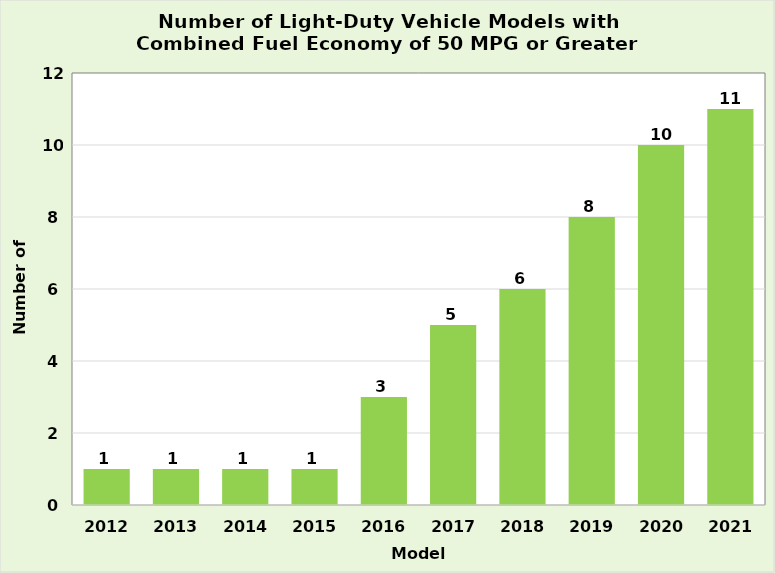
| Category | Series 1 |
|---|---|
| 2012.0 | 1 |
| 2013.0 | 1 |
| 2014.0 | 1 |
| 2015.0 | 1 |
| 2016.0 | 3 |
| 2017.0 | 5 |
| 2018.0 | 6 |
| 2019.0 | 8 |
| 2020.0 | 10 |
| 2021.0 | 11 |